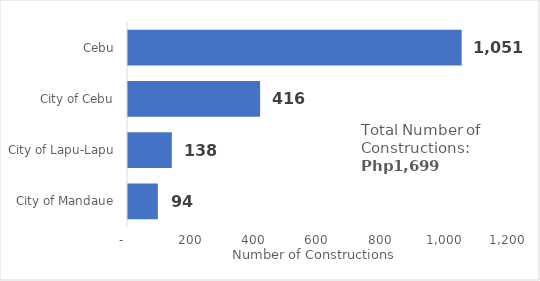
| Category | No of Cons |
|---|---|
| City of Mandaue | 94 |
| City of Lapu-Lapu | 138 |
| City of Cebu | 416 |
| Cebu | 1051 |